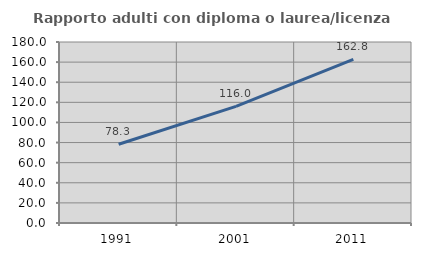
| Category | Rapporto adulti con diploma o laurea/licenza media  |
|---|---|
| 1991.0 | 78.308 |
| 2001.0 | 115.965 |
| 2011.0 | 162.812 |